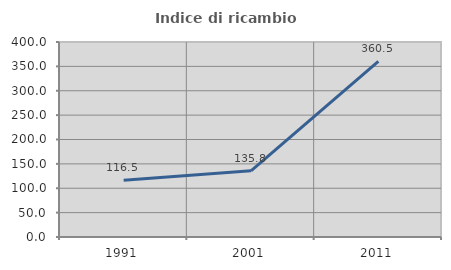
| Category | Indice di ricambio occupazionale  |
|---|---|
| 1991.0 | 116.484 |
| 2001.0 | 135.802 |
| 2011.0 | 360.465 |